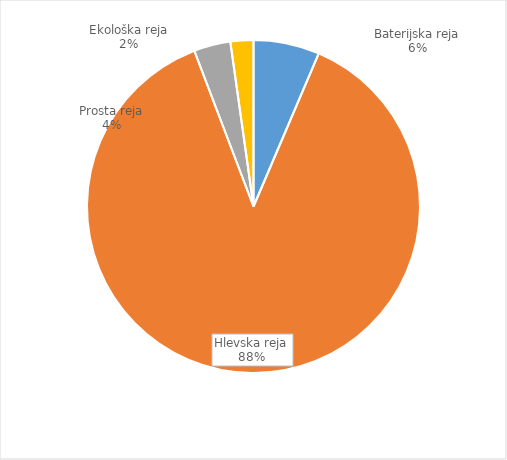
| Category | Količina kosov jajc |
|---|---|
| Baterijska reja | 205009 |
| Hlevska reja | 2806997 |
| Prosta reja | 113675 |
| Ekološka reja | 71140 |